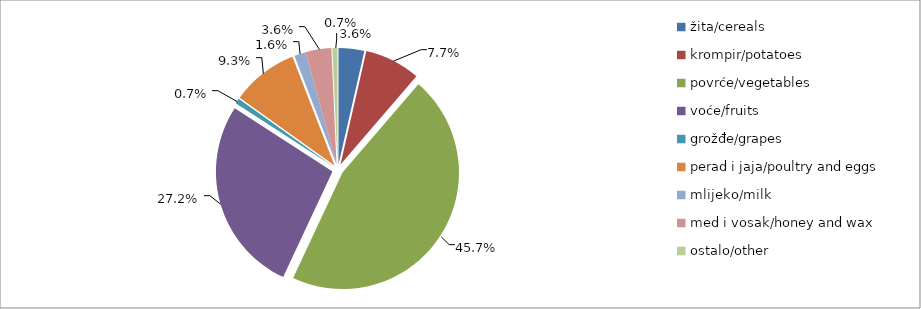
| Category | Series 0 |
|---|---|
| žita/cereals | 87319 |
| krompir/potatoes | 189687 |
| povrće/vegetables | 1119674.5 |
| voće/fruits | 666518 |
| grožđe/grapes | 17474 |
| perad i jaja/poultry and eggs | 227100 |
| mlijeko/milk | 39474 |
| med i vosak/honey and wax | 87439 |
| ostalo/other | 17275 |